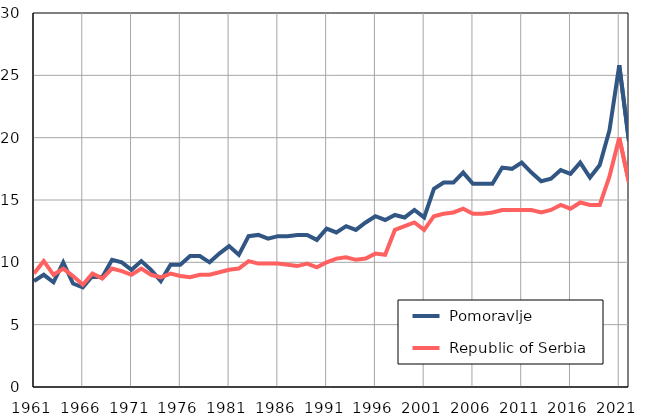
| Category |  Pomoravlje |  Republic of Serbia |
|---|---|---|
| 1961.0 | 8.5 | 9.1 |
| 1962.0 | 9 | 10.1 |
| 1963.0 | 8.4 | 9 |
| 1964.0 | 10 | 9.5 |
| 1965.0 | 8.3 | 8.9 |
| 1966.0 | 8 | 8.2 |
| 1967.0 | 8.9 | 9.1 |
| 1968.0 | 8.8 | 8.7 |
| 1969.0 | 10.2 | 9.5 |
| 1970.0 | 10 | 9.3 |
| 1971.0 | 9.4 | 9 |
| 1972.0 | 10.1 | 9.5 |
| 1973.0 | 9.4 | 9 |
| 1974.0 | 8.5 | 8.8 |
| 1975.0 | 9.8 | 9.1 |
| 1976.0 | 9.8 | 8.9 |
| 1977.0 | 10.5 | 8.8 |
| 1978.0 | 10.5 | 9 |
| 1979.0 | 10 | 9 |
| 1980.0 | 10.7 | 9.2 |
| 1981.0 | 11.3 | 9.4 |
| 1982.0 | 10.6 | 9.5 |
| 1983.0 | 12.1 | 10.1 |
| 1984.0 | 12.2 | 9.9 |
| 1985.0 | 11.9 | 9.9 |
| 1986.0 | 12.1 | 9.9 |
| 1987.0 | 12.1 | 9.8 |
| 1988.0 | 12.2 | 9.7 |
| 1989.0 | 12.2 | 9.9 |
| 1990.0 | 11.8 | 9.6 |
| 1991.0 | 12.7 | 10 |
| 1992.0 | 12.4 | 10.3 |
| 1993.0 | 12.9 | 10.4 |
| 1994.0 | 12.6 | 10.2 |
| 1995.0 | 13.2 | 10.3 |
| 1996.0 | 13.7 | 10.7 |
| 1997.0 | 13.4 | 10.6 |
| 1998.0 | 13.8 | 12.6 |
| 1999.0 | 13.6 | 12.9 |
| 2000.0 | 14.2 | 13.2 |
| 2001.0 | 13.6 | 12.6 |
| 2002.0 | 15.9 | 13.7 |
| 2003.0 | 16.4 | 13.9 |
| 2004.0 | 16.4 | 14 |
| 2005.0 | 17.2 | 14.3 |
| 2006.0 | 16.3 | 13.9 |
| 2007.0 | 16.3 | 13.9 |
| 2008.0 | 16.3 | 14 |
| 2009.0 | 17.6 | 14.2 |
| 2010.0 | 17.5 | 14.2 |
| 2011.0 | 18 | 14.2 |
| 2012.0 | 17.2 | 14.2 |
| 2013.0 | 16.5 | 14 |
| 2014.0 | 16.7 | 14.2 |
| 2015.0 | 17.4 | 14.6 |
| 2016.0 | 17.1 | 14.3 |
| 2017.0 | 18 | 14.8 |
| 2018.0 | 16.8 | 14.6 |
| 2019.0 | 17.8 | 14.6 |
| 2020.0 | 20.6 | 16.9 |
| 2021.0 | 25.8 | 20 |
| 2022.0 | 19.7 | 16.4 |